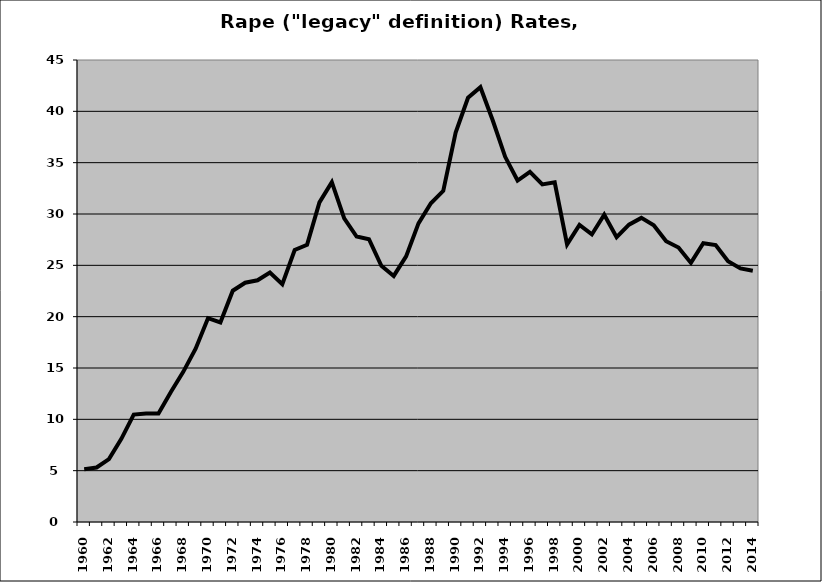
| Category | Rape |
|---|---|
| 1960.0 | 5.147 |
| 1961.0 | 5.307 |
| 1962.0 | 6.129 |
| 1963.0 | 8.095 |
| 1964.0 | 10.466 |
| 1965.0 | 10.563 |
| 1966.0 | 10.573 |
| 1967.0 | 12.66 |
| 1968.0 | 14.624 |
| 1969.0 | 16.882 |
| 1970.0 | 19.851 |
| 1971.0 | 19.435 |
| 1972.0 | 22.529 |
| 1973.0 | 23.307 |
| 1974.0 | 23.546 |
| 1975.0 | 24.308 |
| 1976.0 | 23.161 |
| 1977.0 | 26.492 |
| 1978.0 | 27 |
| 1979.0 | 31.13 |
| 1980.0 | 33.107 |
| 1981.0 | 29.565 |
| 1982.0 | 27.801 |
| 1983.0 | 27.542 |
| 1984.0 | 24.955 |
| 1985.0 | 23.968 |
| 1986.0 | 25.872 |
| 1987.0 | 29.091 |
| 1988.0 | 31.049 |
| 1989.0 | 32.255 |
| 1990.0 | 37.932 |
| 1991.0 | 41.319 |
| 1992.0 | 42.353 |
| 1993.0 | 39.104 |
| 1994.0 | 35.57 |
| 1995.0 | 33.259 |
| 1996.0 | 34.104 |
| 1997.0 | 32.879 |
| 1998.0 | 33.09 |
| 1999.0 | 27.041 |
| 2000.0 | 28.929 |
| 2001.0 | 28.008 |
| 2002.0 | 29.934 |
| 2003.0 | 27.744 |
| 2004.0 | 28.957 |
| 2005.0 | 29.62 |
| 2006.0 | 28.906 |
| 2007.0 | 27.343 |
| 2008.0 | 26.736 |
| 2009.0 | 25.237 |
| 2010.0 | 27.16 |
| 2011.0 | 26.978 |
| 2012.0 | 25.406 |
| 2013.0 | 24.701 |
| 2014.0 | 24.481 |